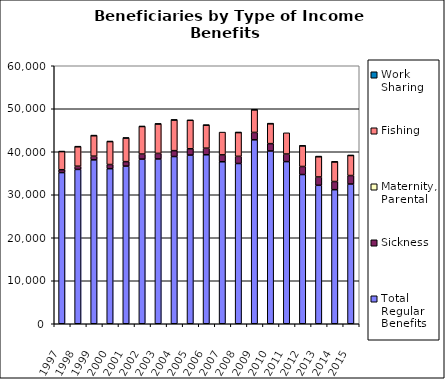
| Category | Total Regular Benefits | Sickness | Maternity, Parental | Fishing | Work Sharing |
|---|---|---|---|---|---|
| 1997.0 | 35156 | 668 |  | 4229 | 48 |
| 1998.0 | 35893 | 742 |  | 4552 | 28 |
| 1999.0 | 38117 | 856 |  | 4788 | 13 |
| 2000.0 | 36064 | 968 |  | 5355 | 15 |
| 2001.0 | 36660 | 1047 |  | 5495 | 29 |
| 2002.0 | 38282 | 1183 |  | 6421 | 24 |
| 2003.0 | 38324 | 1295 |  | 6861 | 11 |
| 2004.0 | 38891 | 1364 |  | 7148 | 4 |
| 2005.0 | 39221 | 1466 |  | 6631 | 5 |
| 2006.0 | 39298 | 1533 |  | 5367 | 3 |
| 2007.0 | 37672 | 1602 |  | 5298 | 0 |
| 2008.0 | 37265 | 1670 |  | 5553 | 3 |
| 2009.0 | 42778 | 1714 |  | 5282 | 9 |
| 2010.0 | 40182 | 1704 |  | 4654 | 7 |
| 2011.0 | 37704 | 1766 |  | 4936 | 0 |
| 2012.0 | 34702 | 1873 |  | 4809 | 30 |
| 2013.0 | 32201 | 1935 |  | 4743 | 1 |
| 2014.0 | 31175 | 1906 |  | 4580 | 5 |
| 2015.0 | 32493 | 1978 |  | 4678 | 11 |